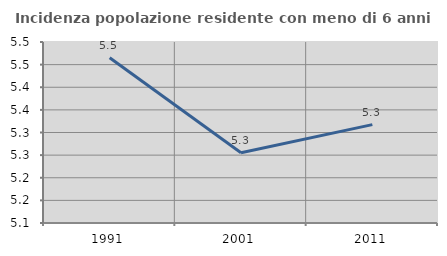
| Category | Incidenza popolazione residente con meno di 6 anni |
|---|---|
| 1991.0 | 5.465 |
| 2001.0 | 5.255 |
| 2011.0 | 5.317 |